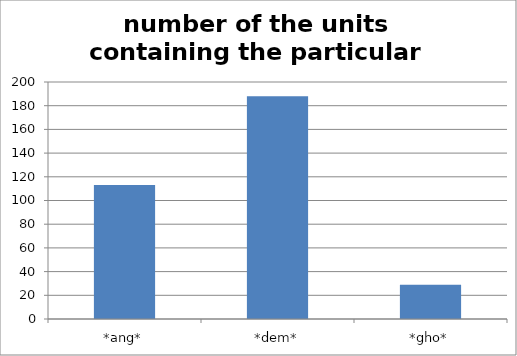
| Category | Series 0 |
|---|---|
| *ang* | 113 |
| *dem* | 188 |
| *gho* | 29 |